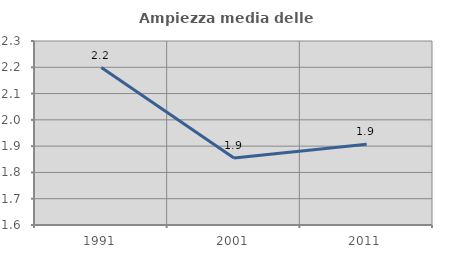
| Category | Ampiezza media delle famiglie |
|---|---|
| 1991.0 | 2.199 |
| 2001.0 | 1.855 |
| 2011.0 | 1.907 |